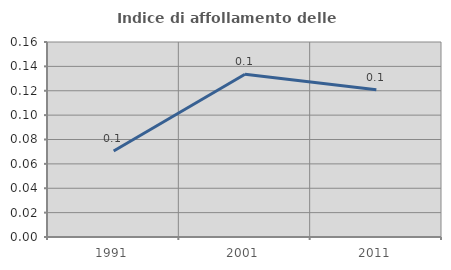
| Category | Indice di affollamento delle abitazioni  |
|---|---|
| 1991.0 | 0.071 |
| 2001.0 | 0.134 |
| 2011.0 | 0.121 |